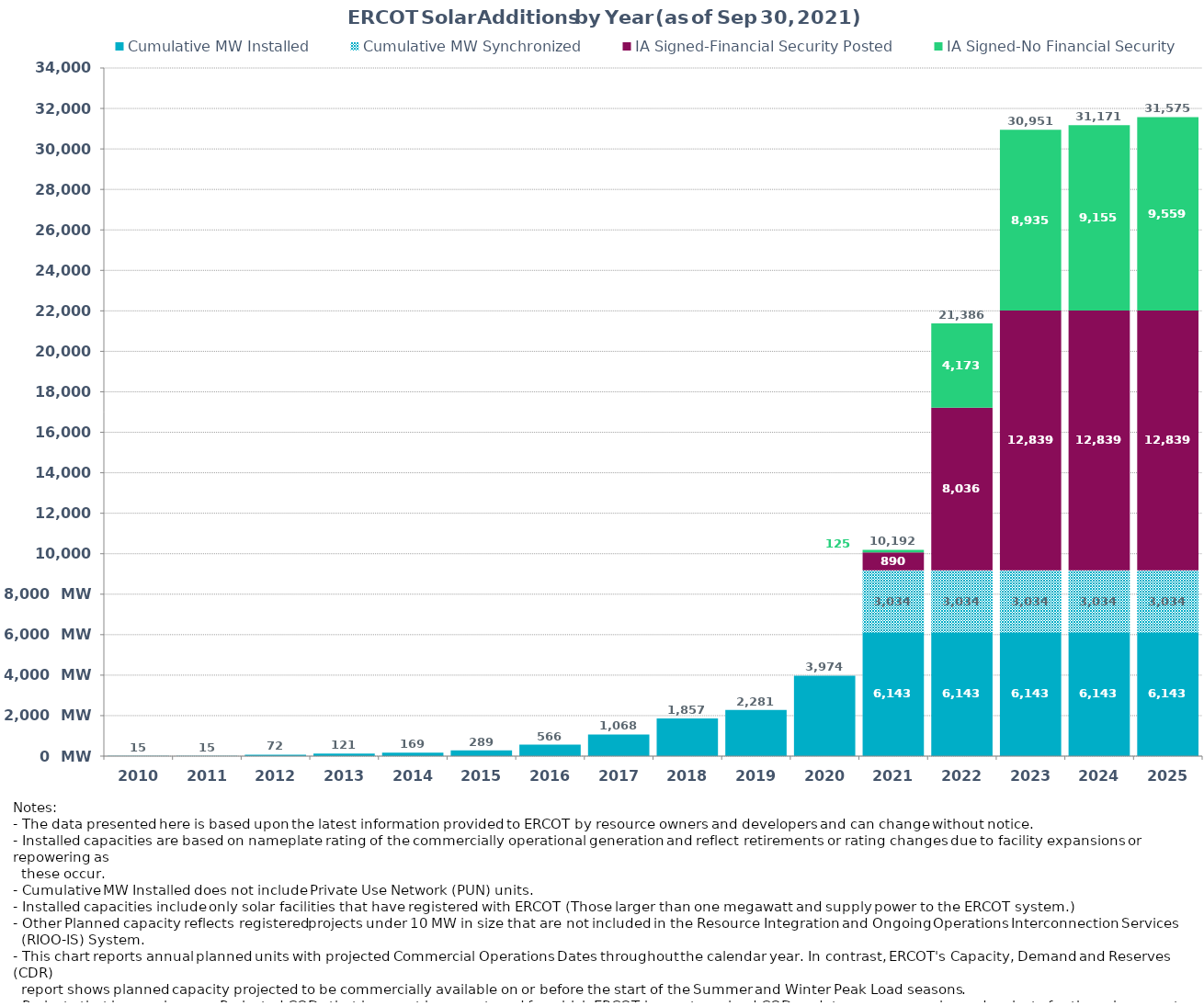
| Category | Cumulative MW Installed | Cumulative MW Synchronized | IA Signed-Financial Security Posted  | IA Signed-No Financial Security  | Other Planned | Cumulative Installed and Planned |
|---|---|---|---|---|---|---|
| 2010.0 | 15 | 0 | 0 | 0 | 0 | 15 |
| 2011.0 | 15 | 0 | 0 | 0 | 0 | 15 |
| 2012.0 | 72.3 | 0 | 0 | 0 | 0 | 72.3 |
| 2013.0 | 121.2 | 0 | 0 | 0 | 0 | 121.2 |
| 2014.0 | 168.7 | 0 | 0 | 0 | 0 | 168.7 |
| 2015.0 | 289.28 | 0 | 0 | 0 | 0 | 289.28 |
| 2016.0 | 565.78 | 0 | 0 | 0 | 0 | 565.78 |
| 2017.0 | 1067.78 | 0 | 0 | 0 | 0 | 1067.78 |
| 2018.0 | 1856.78 | 0 | 0 | 0 | 0 | 1856.78 |
| 2019.0 | 2281.38 | 0 | 0 | 0 | 0 | 2281.38 |
| 2020.0 | 3973.5 | 0 | 0 | 0 | 0 | 3973.5 |
| 2021.0 | 6143.1 | 3034.13 | 890 | 125 | 0 | 10192.23 |
| 2022.0 | 6143.1 | 3034.13 | 8036.43 | 4172.5 | 0 | 21386.16 |
| 2023.0 | 6143.1 | 3034.13 | 12838.86 | 8934.7 | 0 | 30950.79 |
| 2024.0 | 6143.1 | 3034.13 | 12838.86 | 9155.03 | 0 | 31171.12 |
| 2025.0 | 6143.1 | 3034.13 | 12838.86 | 9558.93 | 0 | 31575.02 |